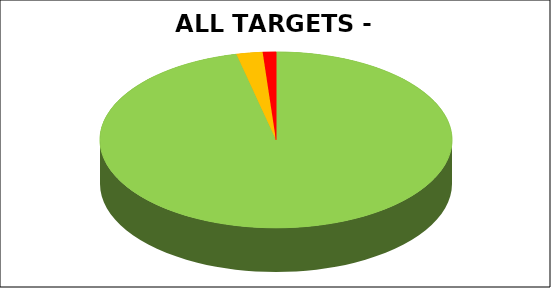
| Category | Series 0 |
|---|---|
| Green | 0.964 |
| Amber | 0.024 |
| Red | 0.012 |